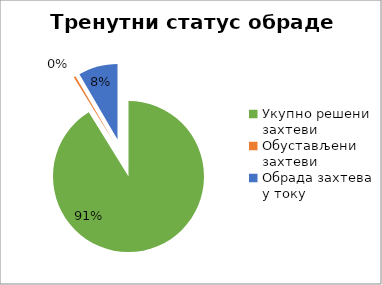
| Category | Series 0 |
|---|---|
| Укупно решени захтеви | 66472 |
| Обустављени захтеви | 298 |
| Обрада захтева у току | 6132 |